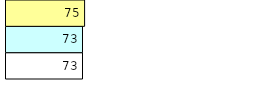
| Category | Total Standouts | Total Recd | Total Tipsters |
|---|---|---|---|
| 0 | 73 | 73 | 75 |